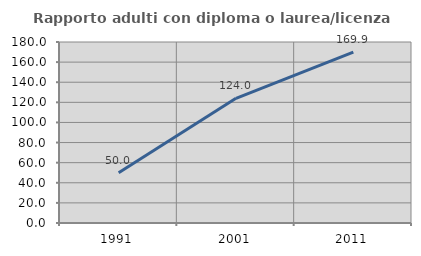
| Category | Rapporto adulti con diploma o laurea/licenza media  |
|---|---|
| 1991.0 | 50 |
| 2001.0 | 124 |
| 2011.0 | 169.863 |